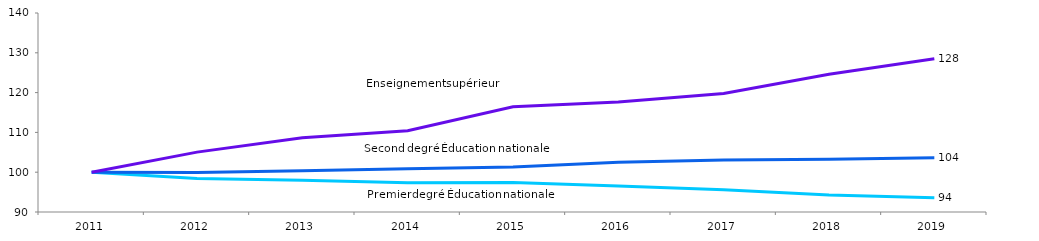
| Category | Premier degré Éducation nationale | Second degré Éducation nationale | Enseignement supérieur (1) |
|---|---|---|---|
| 2011.0 | 100 | 100 | 100 |
| 2012.0 | 98.4 | 99.95 | 105.046 |
| 2013.0 | 97.971 | 100.365 | 108.652 |
| 2014.0 | 97.372 | 100.857 | 110.422 |
| 2015.0 | 97.41 | 101.329 | 116.457 |
| 2016.0 | 96.526 | 102.481 | 117.659 |
| 2017.0 | 95.581 | 103.048 | 119.77 |
| 2018.0 | 94.241 | 103.239 | 124.629 |
| 2019.0 | 93.57 | 103.613 | 128.494 |